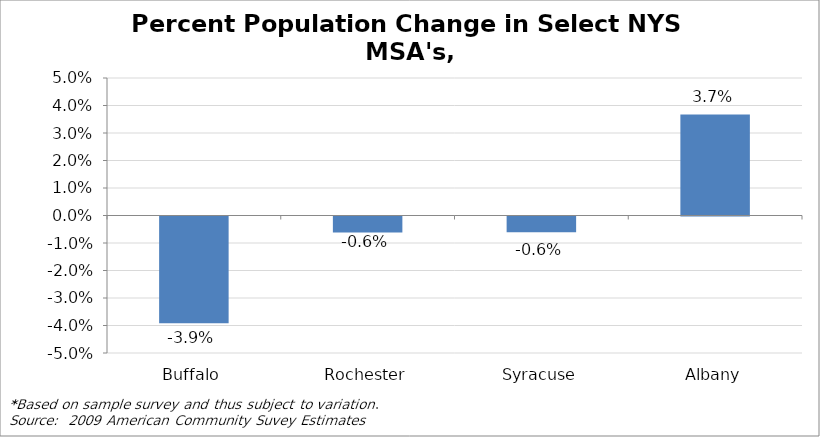
| Category | Series 0 |
|---|---|
| Buffalo | -0.039 |
| Rochester | -0.006 |
| Syracuse | -0.006 |
| Albany | 0.037 |